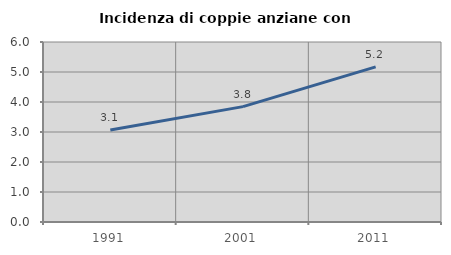
| Category | Incidenza di coppie anziane con figli |
|---|---|
| 1991.0 | 3.065 |
| 2001.0 | 3.846 |
| 2011.0 | 5.17 |